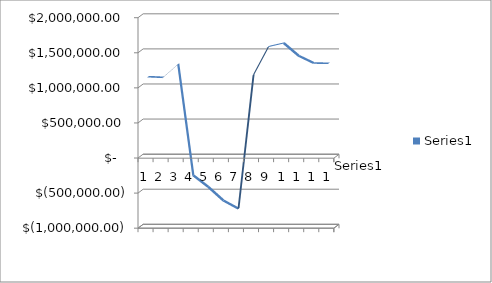
| Category | Series 0 |
|---|---|
| 0 | 1116831.23 |
| 1 | 1106767.35 |
| 2 | 1295902.33 |
| 3 | -289331.92 |
| 4 | -455186.52 |
| 5 | -648700.03 |
| 6 | -764664.79 |
| 7 | 1143268.42 |
| 8 | 1546670.11 |
| 9 | 1596498.52 |
| 10 | 1413943 |
| 11 | 1310943 |
| 12 | 1307619 |